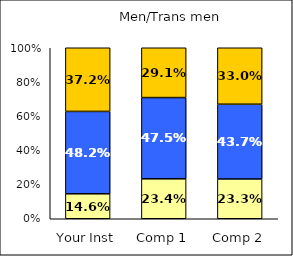
| Category | Low Institutional Priority: Civic Engagement | Average Institutional Priority: Civic Engagement | High Institutional Priority: Civic Engagement |
|---|---|---|---|
| Your Inst | 0.146 | 0.482 | 0.372 |
| Comp 1 | 0.234 | 0.475 | 0.291 |
| Comp 2 | 0.233 | 0.437 | 0.33 |